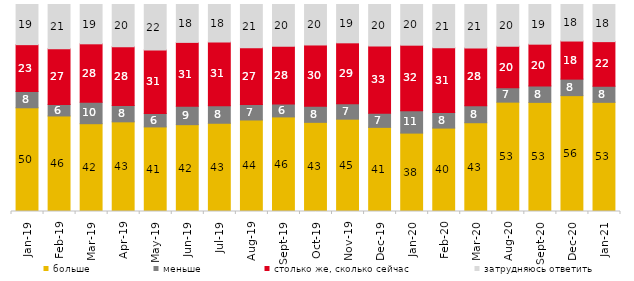
| Category | больше | меньше | столько же, сколько сейчас | затрудняюсь ответить |
|---|---|---|---|---|
| 2019-01-01 | 50.1 | 7.85 | 22.65 | 19.4 |
| 2019-02-01 | 46.15 | 5.6 | 26.9 | 21.35 |
| 2019-03-01 | 42.417 | 10.343 | 28.245 | 18.996 |
| 2019-04-01 | 43.317 | 7.871 | 28.416 | 20.396 |
| 2019-05-01 | 40.862 | 6.439 | 30.758 | 21.942 |
| 2019-06-01 | 41.945 | 8.878 | 30.873 | 18.304 |
| 2019-07-01 | 42.624 | 8.465 | 30.792 | 18.119 |
| 2019-08-01 | 44.206 | 7.493 | 27.373 | 20.929 |
| 2019-09-01 | 45.693 | 6.287 | 27.822 | 20.198 |
| 2019-10-01 | 43.069 | 7.723 | 29.653 | 19.554 |
| 2019-11-01 | 44.604 | 7.426 | 29.455 | 18.515 |
| 2019-12-01 | 40.644 | 6.782 | 32.574 | 20 |
| 2020-01-01 | 37.871 | 10.842 | 31.634 | 19.653 |
| 2020-02-01 | 40.297 | 7.525 | 31.287 | 20.891 |
| 2020-03-01 | 42.885 | 8.18 | 27.913 | 21.021 |
| 2020-08-01 | 52.83 | 6.902 | 20.06 | 20.209 |
| 2020-09-01 | 52.713 | 7.964 | 20.159 | 19.164 |
| 2020-12-01 | 55.974 | 7.982 | 18.394 | 17.65 |
| 2021-01-01 | 52.707 | 7.799 | 21.51 | 17.933 |